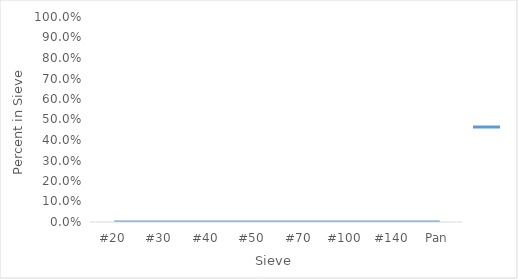
| Category | Series 0 |
|---|---|
| #20 | 0 |
| #30 | 0 |
| #40 | 0 |
| #50 | 0 |
| #70 | 0 |
| #100 | 0 |
| #140 | 0 |
| Pan | 0 |